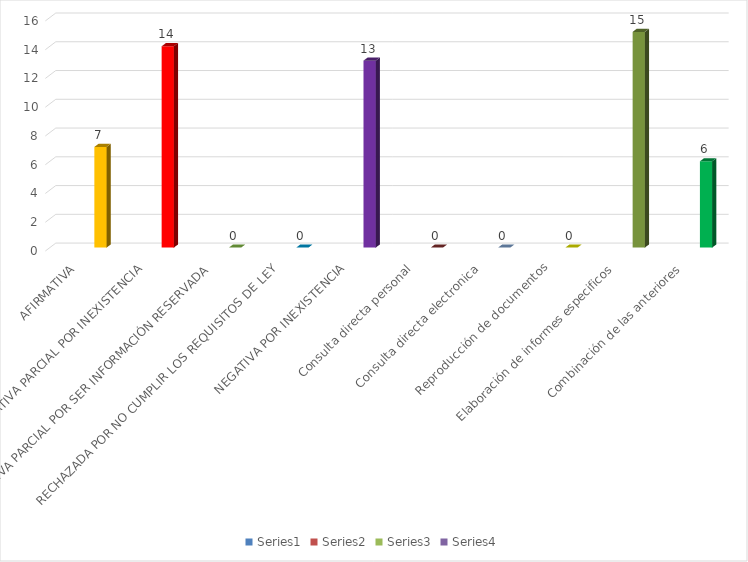
| Category | Series 0 | Series 1 | Series 2 | Series 3 |
|---|---|---|---|---|
| AFIRMATIVA |  |  |  | 7 |
| AFIRMATIVA PARCIAL POR INEXISTENCIA |  |  |  | 14 |
| AFIRMATIVA PARCIAL POR SER INFORMACIÓN RESERVADA |  |  |  | 0 |
| RECHAZADA POR NO CUMPLIR LOS REQUISITOS DE LEY |  |  |  | 0 |
| NEGATIVA POR INEXISTENCIA |  |  |  | 13 |
| Consulta directa personal |  |  |  | 0 |
| Consulta directa electronica |  |  |  | 0 |
| Reproducción de documentos |  |  |  | 0 |
| Elaboración de informes especificos |  |  |  | 15 |
| Combinación de las anteriores |  |  |  | 6 |